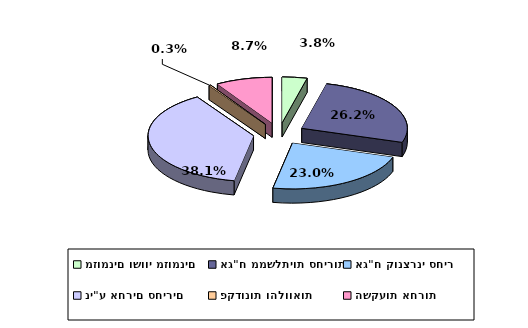
| Category | Series 0 |
|---|---|
| מזומנים ושווי מזומנים | 0.038 |
| אג"ח ממשלתיות סחירות | 0.262 |
| אג"ח קונצרני סחיר | 0.23 |
| ני"ע אחרים סחירים | 0.381 |
| פקדונות והלוואות | 0.003 |
| השקעות אחרות | 0.087 |